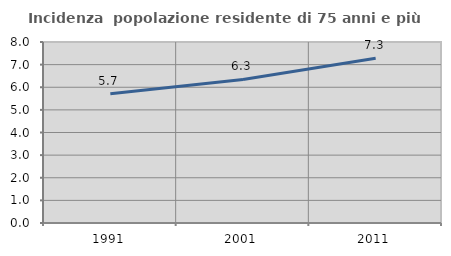
| Category | Incidenza  popolazione residente di 75 anni e più |
|---|---|
| 1991.0 | 5.716 |
| 2001.0 | 6.344 |
| 2011.0 | 7.284 |